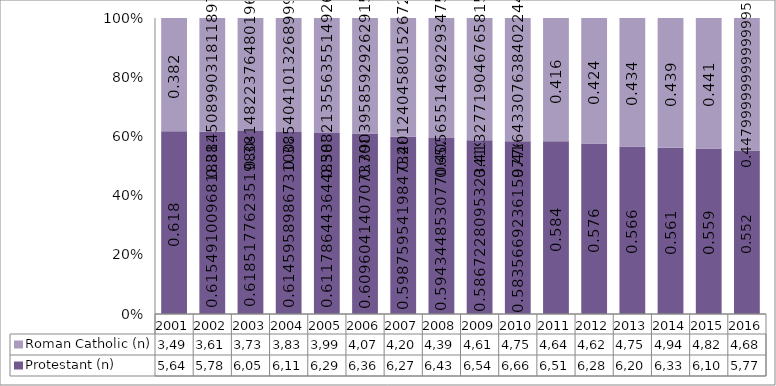
| Category | Protestant (n) | Roman Catholic (n) |
|---|---|---|
| 2001.0 | 5640 | 3493 |
| 2002.0 | 5785 | 3614 |
| 2003.0 | 6059 | 3737 |
| 2004.0 | 6114 | 3834 |
| 2005.0 | 6291 | 3992 |
| 2006.0 | 6360 | 4073 |
| 2007.0 | 6275 | 4205 |
| 2008.0 | 6432 | 4390 |
| 2009.0 | 6549 | 4613 |
| 2010.0 | 6662 | 4754 |
| 2011.0 | 6511 | 4647 |
| 2012.0 | 6283 | 4624 |
| 2013.0 | 6201 | 4755 |
| 2014.0 | 6332 | 4947 |
| 2015.0 | 6108 | 4822 |
| 2016.0 | 5778 | 4683 |